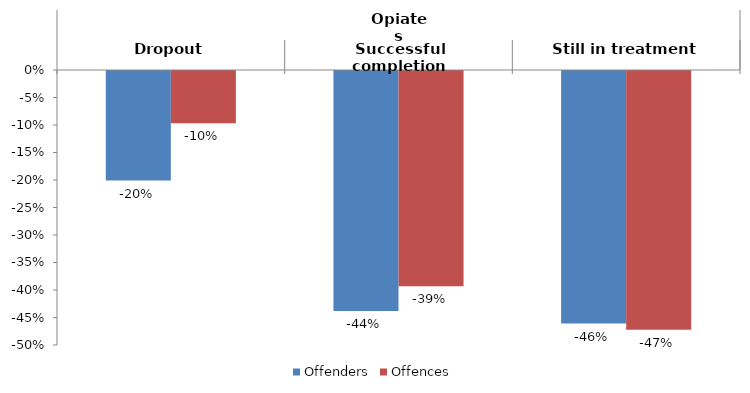
| Category | Offenders | Offences |
|---|---|---|
| 0 | -0.199 | -0.095 |
| 1 | -0.436 | -0.391 |
| 2 | -0.459 | -0.47 |